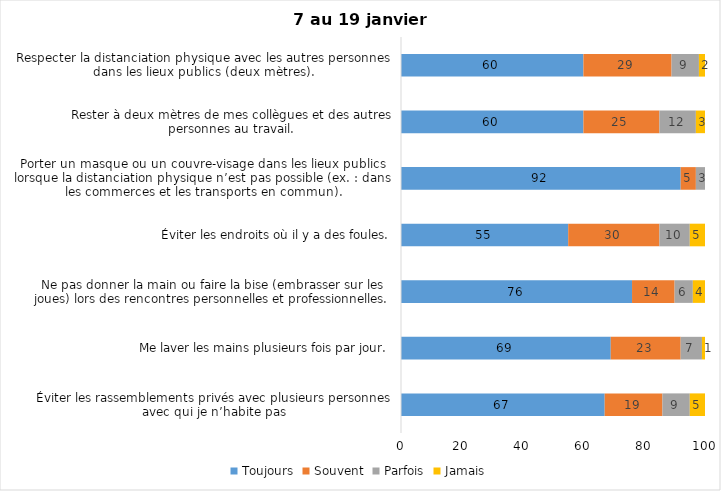
| Category | Toujours | Souvent | Parfois | Jamais |
|---|---|---|---|---|
| Éviter les rassemblements privés avec plusieurs personnes avec qui je n’habite pas | 67 | 19 | 9 | 5 |
| Me laver les mains plusieurs fois par jour. | 69 | 23 | 7 | 1 |
| Ne pas donner la main ou faire la bise (embrasser sur les joues) lors des rencontres personnelles et professionnelles. | 76 | 14 | 6 | 4 |
| Éviter les endroits où il y a des foules. | 55 | 30 | 10 | 5 |
| Porter un masque ou un couvre-visage dans les lieux publics lorsque la distanciation physique n’est pas possible (ex. : dans les commerces et les transports en commun). | 92 | 5 | 3 | 0 |
| Rester à deux mètres de mes collègues et des autres personnes au travail. | 60 | 25 | 12 | 3 |
| Respecter la distanciation physique avec les autres personnes dans les lieux publics (deux mètres). | 60 | 29 | 9 | 2 |